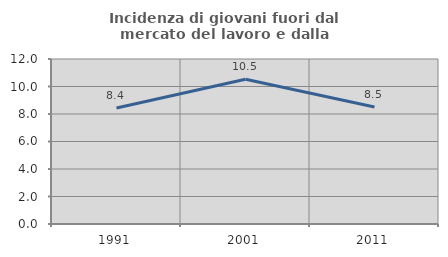
| Category | Incidenza di giovani fuori dal mercato del lavoro e dalla formazione  |
|---|---|
| 1991.0 | 8.434 |
| 2001.0 | 10.526 |
| 2011.0 | 8.511 |